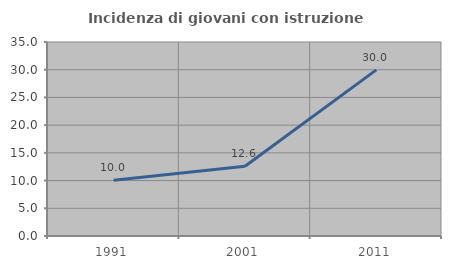
| Category | Incidenza di giovani con istruzione universitaria |
|---|---|
| 1991.0 | 10.046 |
| 2001.0 | 12.598 |
| 2011.0 | 29.964 |